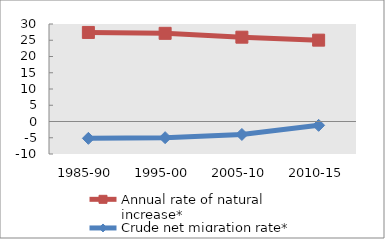
| Category | Annual rate of natural increase* | Crude net migration rate* |
|---|---|---|
| 1985-90 | 27.4 | -5.187 |
| 1995-00 | 27.127 | -4.973 |
| 2005-10 | 25.944 | -3.989 |
| 2010-15 | 25.032 | -1.185 |